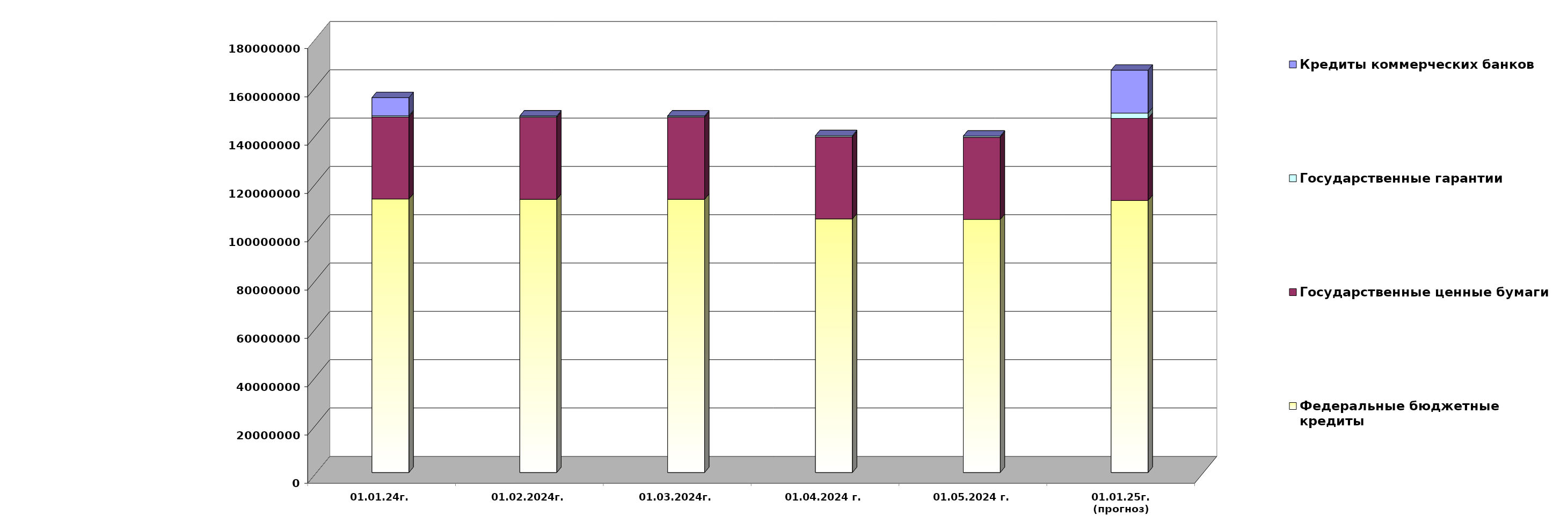
| Category | Федеральные бюджетные кредиты | Государственные ценные бумаги  | Государственные гарантии | Кредиты коммерческих банков |
|---|---|---|---|---|
| 01.01.24г. | 113223150.103 | 34000000 | 492844.914 | 7500000 |
| 01.02.2024г. | 113101358.397 | 34000000 | 490073.841 | 0 |
| 01.03.2024г. | 113101358.397 | 34000000 | 490331.207 | 0 |
| 01.04.2024 г. | 104987610.474 | 34000000 | 490571.969 | 0 |
| 01.05.2024 г. | 104775268.721 | 34000000 | 489600.492 | 0 |
| 01.01.25г.
(прогноз) | 112600448.1 | 34000000 | 2193508.4 | 17760298.9 |